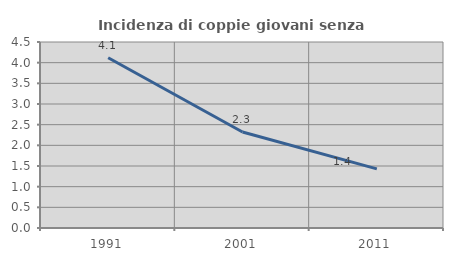
| Category | Incidenza di coppie giovani senza figli |
|---|---|
| 1991.0 | 4.12 |
| 2001.0 | 2.322 |
| 2011.0 | 1.431 |